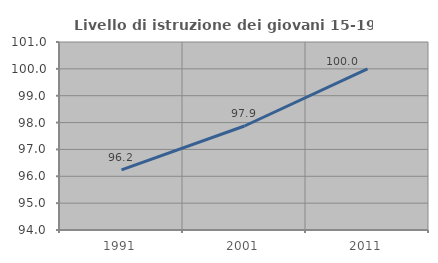
| Category | Livello di istruzione dei giovani 15-19 anni |
|---|---|
| 1991.0 | 96.241 |
| 2001.0 | 97.872 |
| 2011.0 | 100 |